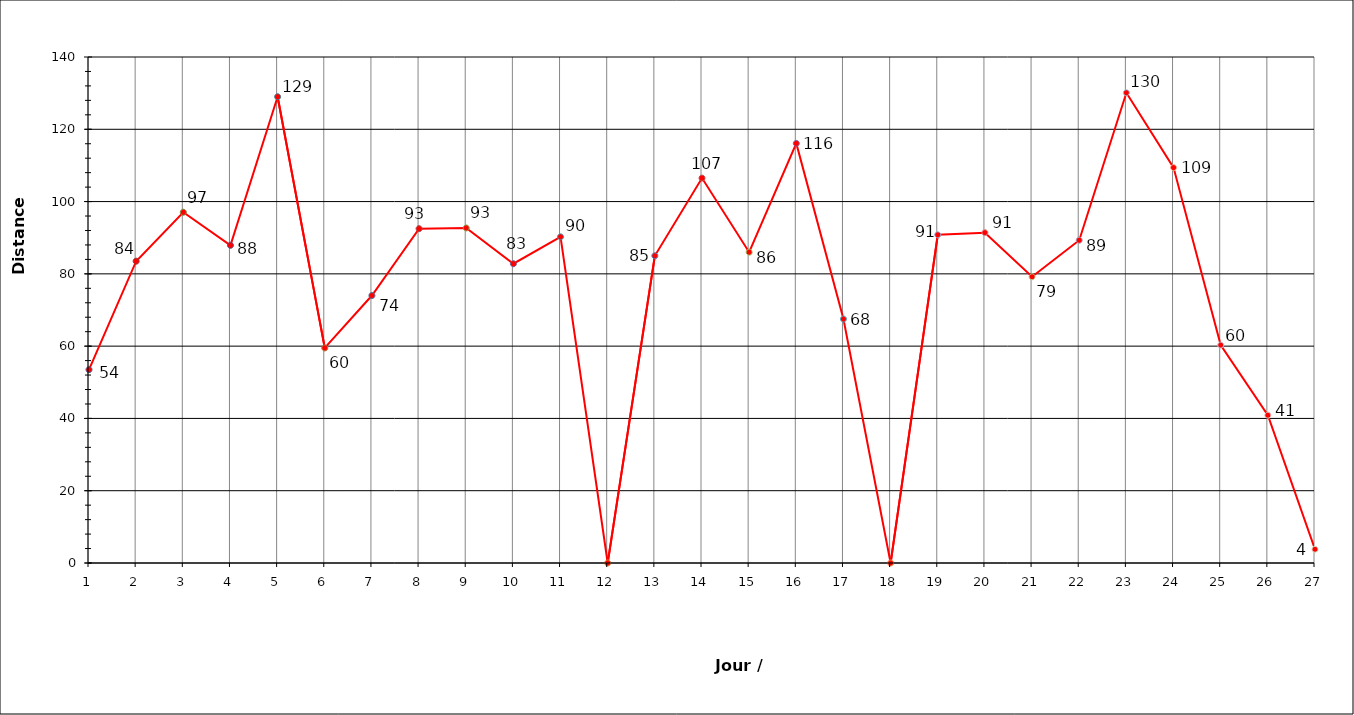
| Category | 1 2 3 4 5 6 7 8 9 10 11 12 13 14 15 16 17 18 19 20 21 22 23 24 25 26 27 |
|---|---|
| 0 | 53.5 |
| 1 | 83.5 |
| 2 | 97.05 |
| 3 | 87.9 |
| 4 | 129 |
| 5 | 59.5 |
| 6 | 74 |
| 7 | 92.5 |
| 8 | 92.7 |
| 9 | 82.8 |
| 10 | 90.25 |
| 11 | 0 |
| 12 | 85 |
| 13 | 106.5 |
| 14 | 86 |
| 15 | 116.1 |
| 16 | 67.5 |
| 17 | 0 |
| 18 | 90.8 |
| 19 | 91.4 |
| 20 | 79.2 |
| 21 | 89.3 |
| 22 | 130.1 |
| 23 | 109.4 |
| 24 | 60.3 |
| 25 | 40.9 |
| 26 | 3.8 |